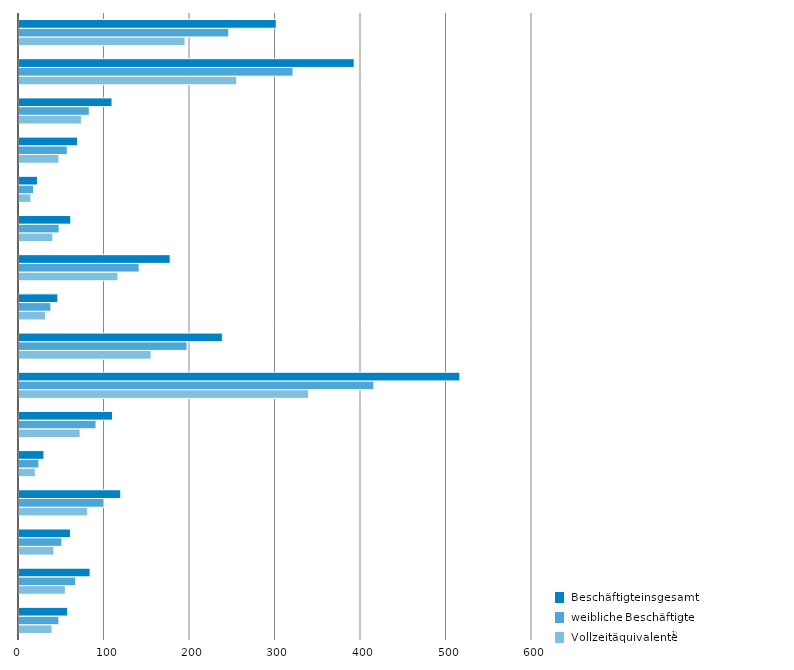
| Category | VZÄ | wB | iB |
|---|---|---|---|
| 0 | 38.624 | 46.668 | 56.873 |
| 1 | 54.258 | 66.415 | 83.16 |
| 2 | 40.902 | 50.165 | 60.211 |
| 3 | 80.321 | 99.406 | 119.055 |
| 4 | 19.076 | 23.276 | 29.207 |
| 5 | 71.503 | 90.064 | 109.346 |
| 6 | 338.763 | 415.022 | 515.627 |
| 7 | 154.579 | 196.617 | 237.867 |
| 8 | 31.036 | 37.308 | 45.466 |
| 9 | 115.765 | 140.504 | 176.813 |
| 10 | 39.639 | 46.982 | 60.583 |
| 11 | 13.98 | 16.988 | 21.568 |
| 12 | 46.657 | 56.472 | 68.406 |
| 13 | 73.019 | 82.221 | 108.794 |
| 14 | 254.641 | 320.508 | 392.105 |
| 15 | 194.24 | 245.38 | 300.919 |